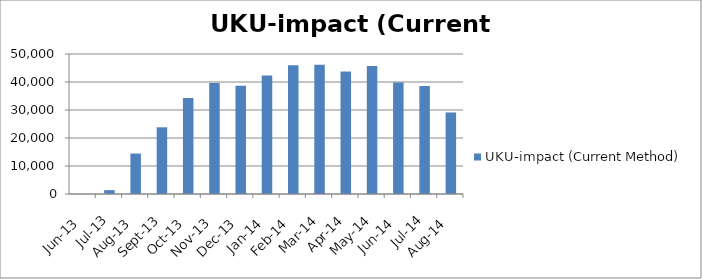
| Category | UKU-impact (Current Method) |
|---|---|
| 2013-06-01 | 0 |
| 2013-07-01 | 1369.489 |
| 2013-08-01 | 14446.563 |
| 2013-09-01 | 23824.689 |
| 2013-10-01 | 34270.01 |
| 2013-11-01 | 39645.135 |
| 2013-12-01 | 38649.31 |
| 2014-01-01 | 42284.644 |
| 2014-02-01 | 45999.107 |
| 2014-03-01 | 46189.325 |
| 2014-04-01 | 43753.938 |
| 2014-05-01 | 45735.451 |
| 2014-06-01 | 39777.01 |
| 2014-07-01 | 38582.007 |
| 2014-08-01 | 29120.87 |